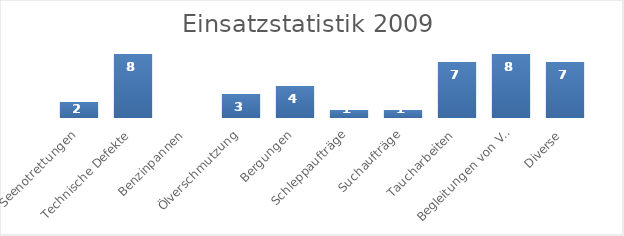
| Category | Series 0 |
|---|---|
| Seenotrettungen | 2 |
| Technische Defekte | 8 |
| Benzinpannen | 0 |
| Ölverschmutzung | 3 |
| Bergungen | 4 |
| Schleppaufträge | 1 |
| Suchaufträge | 1 |
| Taucharbeiten | 7 |
| Begleitungen von Veranstaltungen | 8 |
| Diverse | 7 |